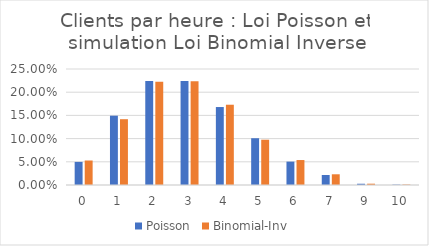
| Category | Poisson | Binomial-Inv |
|---|---|---|
| 0.0 | 0.05 | 0.053 |
| 1.0 | 0.149 | 0.142 |
| 2.0 | 0.224 | 0.222 |
| 3.0 | 0.224 | 0.224 |
| 4.0 | 0.168 | 0.173 |
| 5.0 | 0.101 | 0.098 |
| 6.0 | 0.05 | 0.054 |
| 7.0 | 0.022 | 0.023 |
| 9.0 | 0.003 | 0.003 |
| 10.0 | 0.001 | 0.001 |